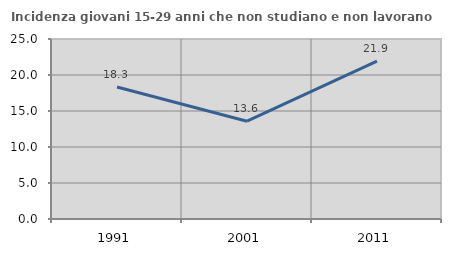
| Category | Incidenza giovani 15-29 anni che non studiano e non lavorano  |
|---|---|
| 1991.0 | 18.336 |
| 2001.0 | 13.58 |
| 2011.0 | 21.928 |